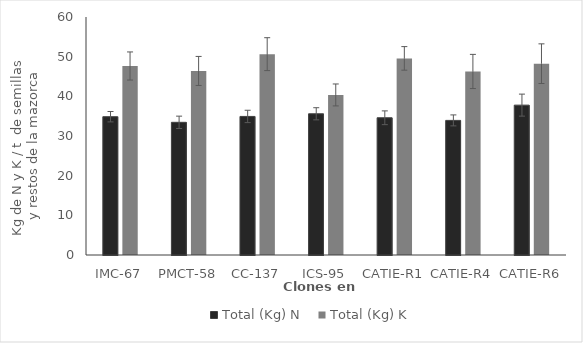
| Category | Total (Kg) N | Total (Kg) K |
|---|---|---|
| IMC-67 | 34.867 | 47.65 |
| PMCT-58 | 33.45 | 46.4 |
| CC-137 | 34.933 | 50.633 |
| ICS-95 | 35.6 | 40.35 |
| CATIE-R1 | 34.6 | 49.567 |
| CATIE-R4 | 33.933 | 46.267 |
| CATIE-R6 | 37.783 | 48.233 |